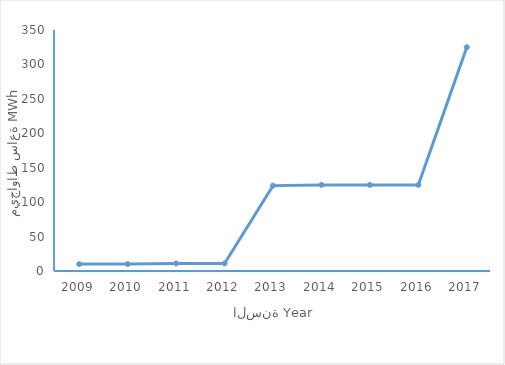
| Category | المجموع  |
|---|---|
| 2009.0 | 10 |
| 2010.0 | 10 |
| 2011.0 | 11 |
| 2012.0 | 11 |
| 2013.0 | 124 |
| 2014.0 | 125 |
| 2015.0 | 125 |
| 2016.0 | 125 |
| 2017.0 | 325 |